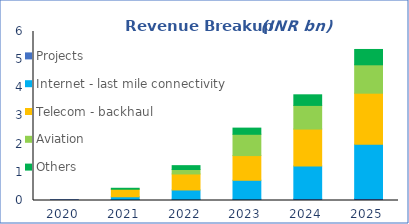
| Category | Projects | Internet - last mile connectivity | Telecom - backhaul | Aviation  | Others |
|---|---|---|---|---|---|
| 2020-03-31 | 29.12 | 0 | 0 | 0 | 0 |
| 2021-03-31 | 35.84 | 96.672 | 266.658 | 0 | 34.988 |
| 2022-03-31 | 46.34 | 327.685 | 568.4 | 157.5 | 137.21 |
| 2023-03-31 | 48.72 | 669.42 | 876.512 | 756 | 219.262 |
| 2024-03-31 | 59.22 | 1166.544 | 1310.064 | 840 | 376.615 |
| 2025-03-31 | 71.54 | 1927.715 | 1810.648 | 1008 | 544.231 |